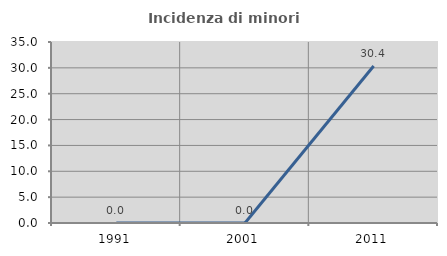
| Category | Incidenza di minori stranieri |
|---|---|
| 1991.0 | 0 |
| 2001.0 | 0 |
| 2011.0 | 30.357 |